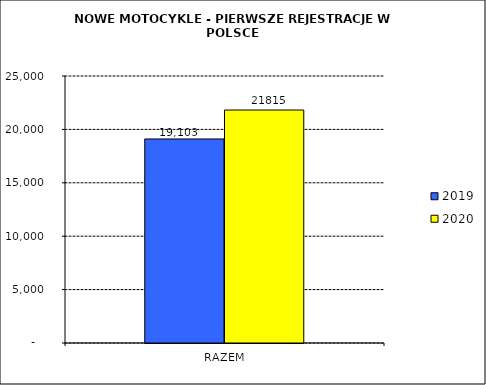
| Category | 2019 | 2020 |
|---|---|---|
| RAZEM | 19103 | 21815 |